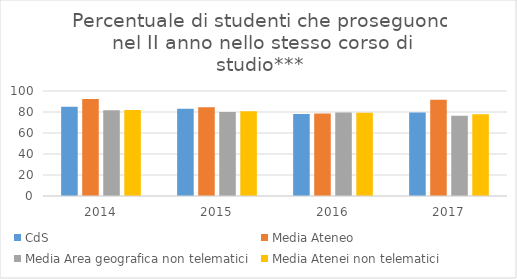
| Category | CdS | Media Ateneo | Media Area geografica non telematici | Media Atenei non telematici |
|---|---|---|---|---|
| 2014.0 | 84.9 | 92.3 | 81.7 | 82 |
| 2015.0 | 83.2 | 84.6 | 79.9 | 80.8 |
| 2016.0 | 78.2 | 78.6 | 79.6 | 79.4 |
| 2017.0 | 79.5 | 91.7 | 76.4 | 77.8 |